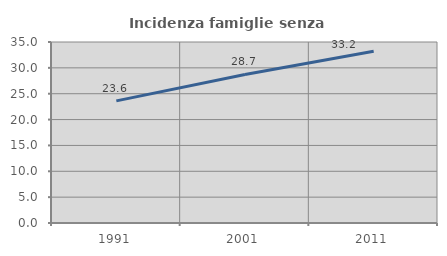
| Category | Incidenza famiglie senza nuclei |
|---|---|
| 1991.0 | 23.612 |
| 2001.0 | 28.728 |
| 2011.0 | 33.224 |